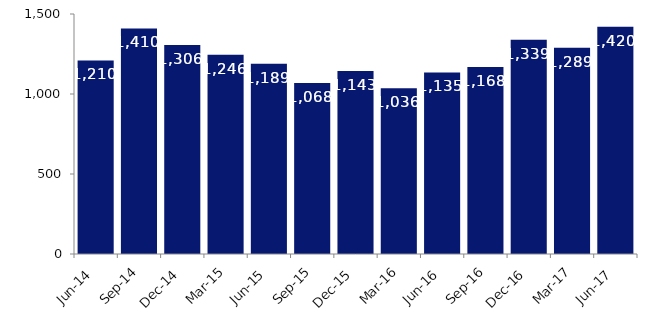
| Category | Series 0 |
|---|---|
| Jun-14 | 1210 |
| Sep-14 | 1410 |
| Dec-14 | 1306 |
| Mar-15 | 1246 |
| Jun-15 | 1189 |
| Sep-15 | 1068 |
| Dec-15 | 1143 |
| Mar-16 | 1036 |
| Jun-16 | 1135 |
| Sep-16 | 1168 |
| Dec-16 | 1339 |
| Mar-17 | 1289 |
| Jun-17 | 1420 |